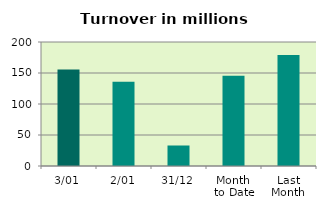
| Category | Series 0 |
|---|---|
| 3/01 | 155.652 |
| 2/01 | 135.853 |
| 31/12 | 33.071 |
| Month 
to Date | 145.752 |
| Last
Month | 179.047 |